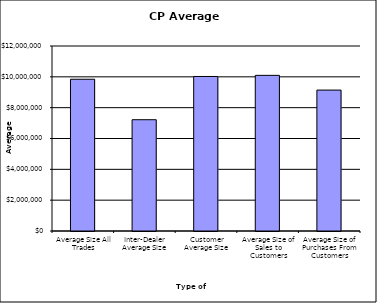
| Category | Security Type |
|---|---|
| Average Size All Trades | 9843583.567 |
| Inter-Dealer Average Size | 7219252.747 |
| Customer Average Size | 10022738.935 |
| Average Size of Sales to Customers | 10095890.333 |
| Average Size of Purchases From Customers | 9139901.961 |